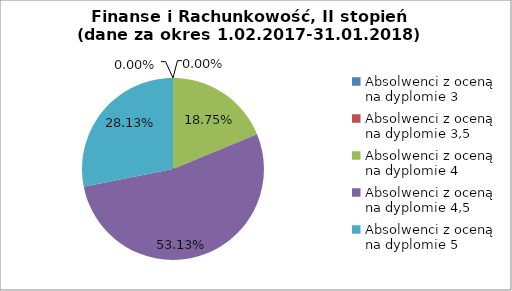
| Category | Series 0 |
|---|---|
| Absolwenci z oceną na dyplomie 3 | 0 |
| Absolwenci z oceną na dyplomie 3,5 | 0 |
| Absolwenci z oceną na dyplomie 4 | 18.75 |
| Absolwenci z oceną na dyplomie 4,5 | 53.125 |
| Absolwenci z oceną na dyplomie 5 | 28.125 |